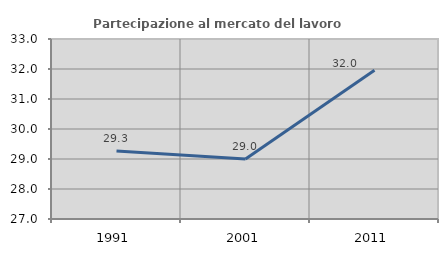
| Category | Partecipazione al mercato del lavoro  femminile |
|---|---|
| 1991.0 | 29.27 |
| 2001.0 | 28.998 |
| 2011.0 | 31.955 |